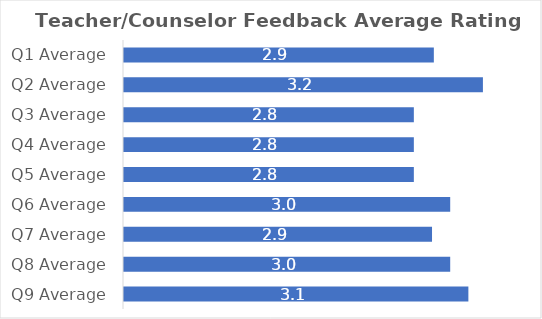
| Category | Series 0 |
|---|---|
| Q1 Average | 2.9 |
| Q2 Average | 3.2 |
| Q3 Average | 2.778 |
| Q4 Average | 2.778 |
| Q5 Average | 2.778 |
| Q6 Average | 3 |
| Q7 Average | 2.889 |
| Q8 Average | 3 |
| Q9 Average | 3.111 |